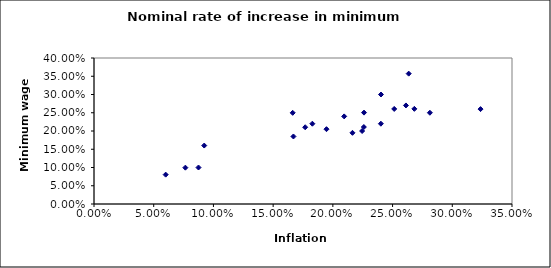
| Category | Nominal rate increase in minimum wage |
|---|---|
| 0.26349852071006263 | 0.357 |
| 0.24030440509292858 | 0.3 |
| 0.1663716814159295 | 0.25 |
| 0.18283594672062223 | 0.22 |
| 0.22450608660945726 | 0.2 |
| 0.20946638107655158 | 0.24 |
| 0.24021636605131858 | 0.22 |
| 0.28124417954926506 | 0.25 |
| 0.2612 | 0.27 |
| 0.32366000634316516 | 0.26 |
| 0.2682400862585361 | 0.261 |
| 0.2513697336104288 | 0.26 |
| 0.22608892579451953 | 0.25 |
| 0.22595739440955565 | 0.211 |
| 0.19465648854961803 | 0.205 |
| 0.21641163611905156 | 0.195 |
| 0.1768385402267072 | 0.21 |
| 0.16699999999999998 | 0.185 |
| 0.09230000000000001 | 0.16 |
| 0.0875 | 0.1 |
| 0.0765 | 0.1 |
| 0.06 | 0.08 |